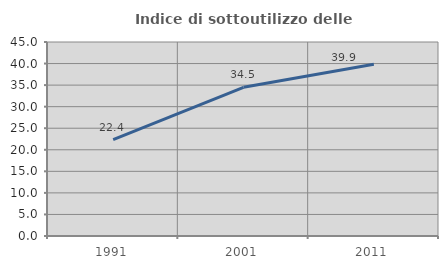
| Category | Indice di sottoutilizzo delle abitazioni  |
|---|---|
| 1991.0 | 22.353 |
| 2001.0 | 34.496 |
| 2011.0 | 39.852 |